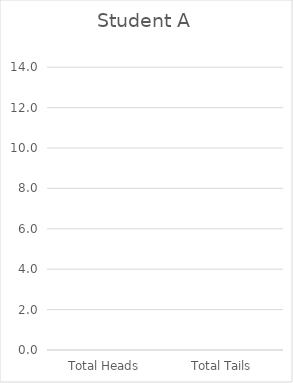
| Category | Series 0 |
|---|---|
| Total Heads | 0 |
| Total Tails | 0 |